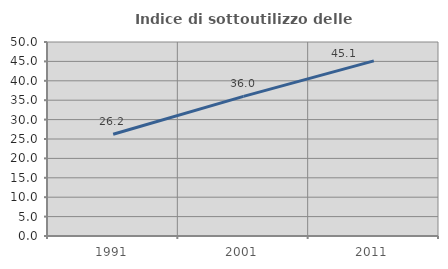
| Category | Indice di sottoutilizzo delle abitazioni  |
|---|---|
| 1991.0 | 26.236 |
| 2001.0 | 35.985 |
| 2011.0 | 45.126 |